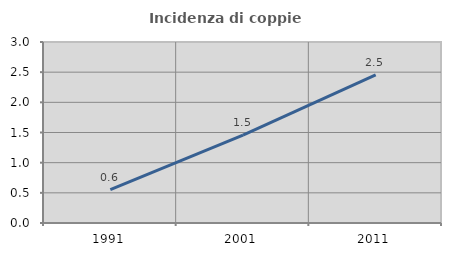
| Category | Incidenza di coppie miste |
|---|---|
| 1991.0 | 0.554 |
| 2001.0 | 1.458 |
| 2011.0 | 2.453 |